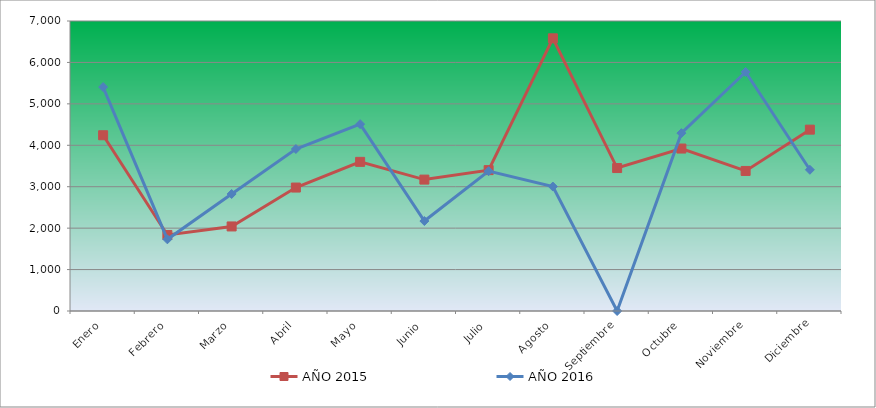
| Category | AÑO 2015 | AÑO 2016 |
|---|---|---|
| Enero | 4242.577 | 5405.698 |
| Febrero | 1834.914 | 1729.715 |
| Marzo | 2040.972 | 2824.487 |
| Abril | 2979.854 | 3909.615 |
| Mayo | 3600.049 | 4510.615 |
| Junio | 3171.865 | 2171.43 |
| Julio | 3400.557 | 3375.559 |
| Agosto | 6581.992 | 3003.835 |
| Septiembre | 3450.273 | 0 |
| Octubre | 3921.313 | 4293.474 |
| Noviembre | 3380.671 | 5769.733 |
| Diciembre | 4377.599 | 3408.392 |